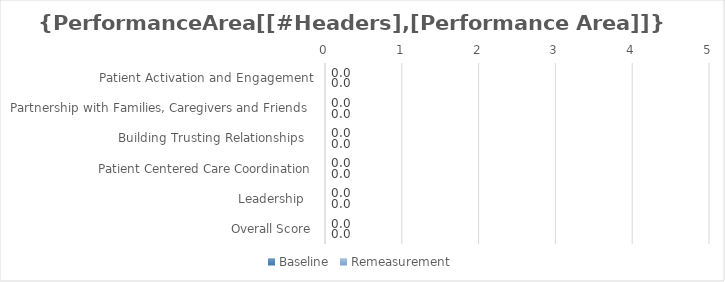
| Category | Baseline | Remeasurement |
|---|---|---|
| Patient Activation and Engagement | 0 | 0 |
| Partnership with Families, Caregivers and Friends  | 0 | 0 |
| Building Trusting Relationships   | 0 | 0 |
| Patient Centered Care Coordination | 0 | 0 |
| Leadership   | 0 | 0 |
| Overall Score | 0 | 0 |